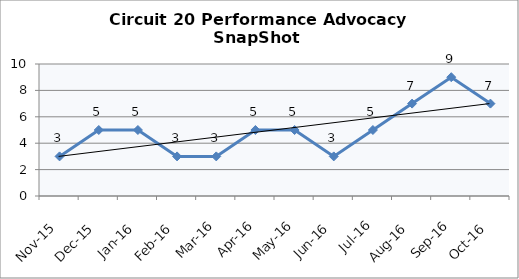
| Category | Circuit 20 |
|---|---|
| Nov-15 | 3 |
| Dec-15 | 5 |
| Jan-16 | 5 |
| Feb-16 | 3 |
| Mar-16 | 3 |
| Apr-16 | 5 |
| May-16 | 5 |
| Jun-16 | 3 |
| Jul-16 | 5 |
| Aug-16 | 7 |
| Sep-16 | 9 |
| Oct-16 | 7 |